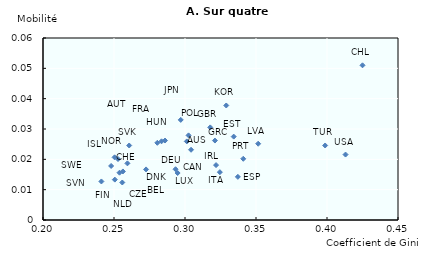
| Category | Series 0 |
|---|---|
| 0.2411275 | 0.013 |
| 0.2479775 | 0.018 |
| 0.25041 | 0.021 |
| 0.250575 | 0.013 |
| 0.25282 | 0.02 |
| 0.253885 | 0.016 |
| 0.2558275 | 0.012 |
| 0.256275 | 0.016 |
| 0.2607025 | 0.025 |
| 0.259433 | 0.019 |
| 0.272575 | 0.017 |
| 0.280505 | 0.025 |
| 0.2834825 | 0.026 |
| 0.285935 | 0.026 |
| 0.297 | 0.033 |
| 0.2933375 | 0.017 |
| 0.294805 | 0.015 |
| 0.30251 | 0.028 |
| 0.30127 | 0.026 |
| 0.30425 | 0.023 |
| 0.31779 | 0.031 |
| 0.32109 | 0.026 |
| 0.3218775 | 0.018 |
| 0.3245575 | 0.016 |
| 0.32905 | 0.038 |
| 0.3343 | 0.027 |
| 0.3372225 | 0.014 |
| 0.3410225 | 0.02 |
| 0.351545 | 0.025 |
| 0.398693 | 0.025 |
| 0.4130575 | 0.022 |
| 0.425 | 0.051 |